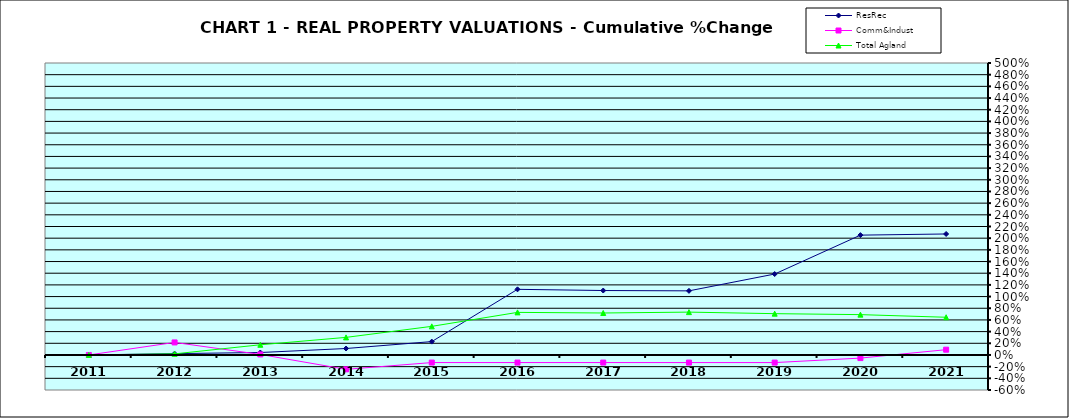
| Category | ResRec | Comm&Indust | Total Agland |
|---|---|---|---|
| 2011.0 | 0 | 0 | 0 |
| 2012.0 | 0.023 | 0.215 | 0.019 |
| 2013.0 | 0.042 | 0.009 | 0.175 |
| 2014.0 | 0.111 | -0.246 | 0.301 |
| 2015.0 | 0.229 | -0.13 | 0.49 |
| 2016.0 | 1.124 | -0.13 | 0.729 |
| 2017.0 | 1.103 | -0.13 | 0.719 |
| 2018.0 | 1.098 | -0.131 | 0.734 |
| 2019.0 | 1.386 | -0.131 | 0.707 |
| 2020.0 | 2.052 | -0.053 | 0.691 |
| 2021.0 | 2.072 | 0.091 | 0.646 |